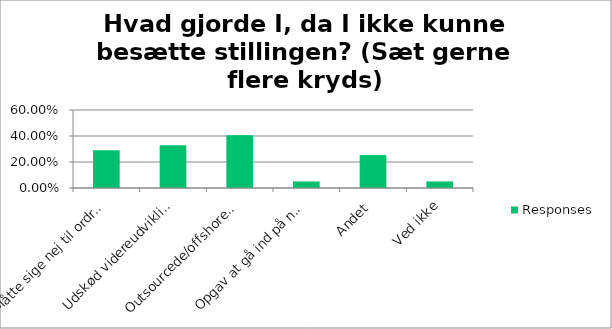
| Category | Responses |
|---|---|
| Måtte sige nej til ordrer/opgaver | 0.291 |
| Udskød videreudvikling/innovation | 0.329 |
| Outsourcede/offshorede | 0.405 |
| Opgav at gå ind på nye markeder | 0.051 |
| Andet | 0.253 |
| Ved ikke | 0.051 |